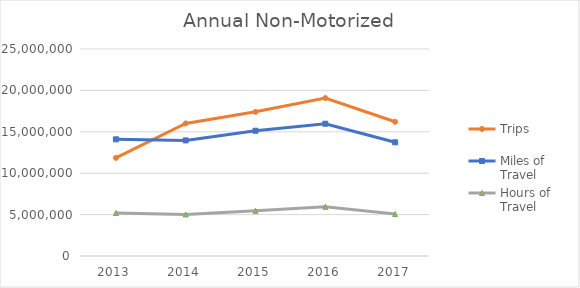
| Category | Trips | Miles of Travel | Hours of Travel |
|---|---|---|---|
| 2013 | 11846264 | 14089110.855 | 5192230.077 |
| 2014 | 16010196.63 | 13959830.133 | 5016063.015 |
| 2015 | 17414021.783 | 15128307.253 | 5453097.271 |
| 2016 | 19079308.553 | 15975509.405 | 5944468.92 |
| 2017 | 16210597.026 | 13729577.358 | 5058513.481 |